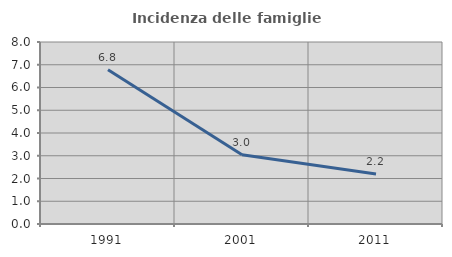
| Category | Incidenza delle famiglie numerose |
|---|---|
| 1991.0 | 6.782 |
| 2001.0 | 3.04 |
| 2011.0 | 2.201 |